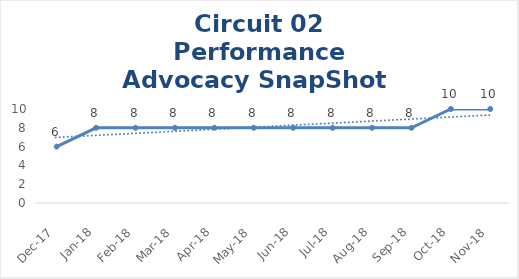
| Category | Circuit 02 |
|---|---|
| Dec-17 | 6 |
| Jan-18 | 8 |
| Feb-18 | 8 |
| Mar-18 | 8 |
| Apr-18 | 8 |
| May-18 | 8 |
| Jun-18 | 8 |
| Jul-18 | 8 |
| Aug-18 | 8 |
| Sep-18 | 8 |
| Oct-18 | 10 |
| Nov-18 | 10 |